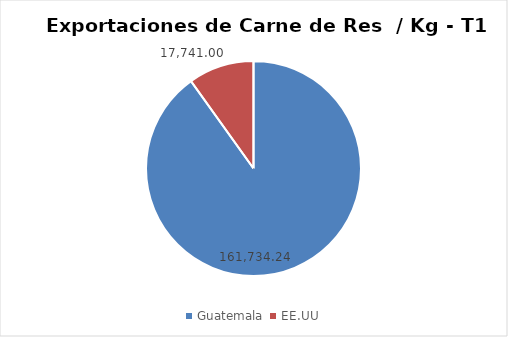
| Category | Series 0 |
|---|---|
| Guatemala  | 161734.238 |
| EE.UU | 17741 |